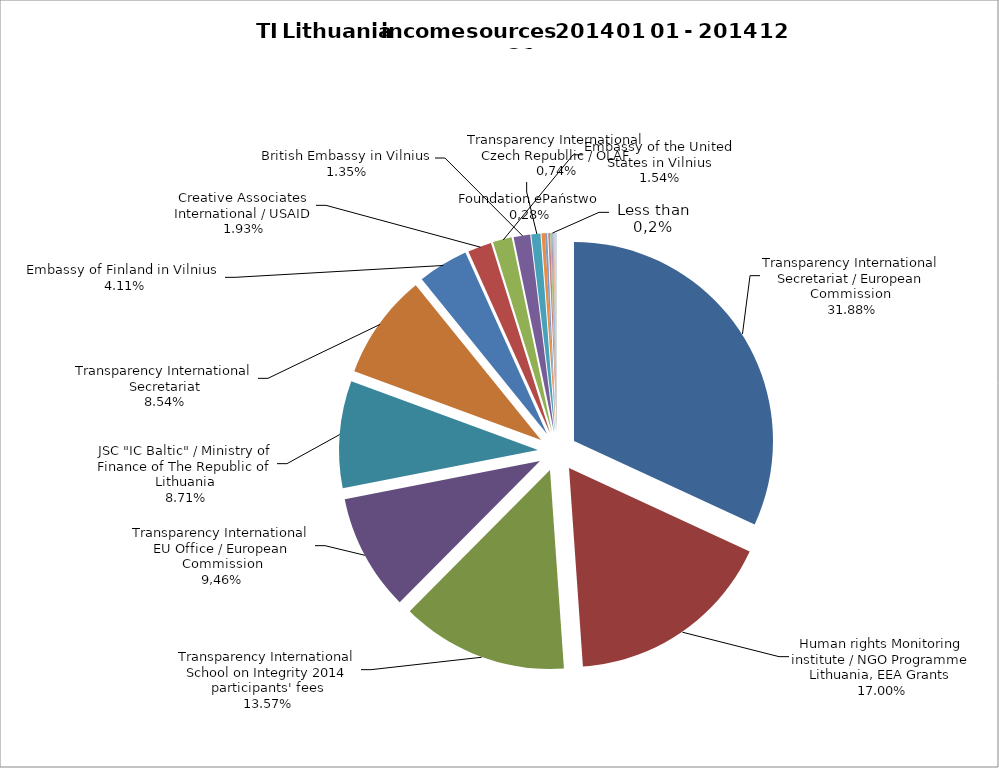
| Category | Income, LTL | Percentage, % |
|---|---|---|
| Transparency International Secretariat / European Commission  | 308089.47 | 31.881 |
| Human rights Monitoring institute / NGO Programme Lithuania, EEA Grants | 164324.14 | 17.004 |
| Transparency International School on Integrity 2014 participants' fees | 131124.23 | 13.568 |
| Transparency International EU Office / European Commission | 91418.27 | 9.46 |
| JSC "IC Baltic" / Ministry of Finance of The Republic of Lithuania | 84172.15 | 8.71 |
| Transparency International Secretariat | 82572.4 | 8.544 |
| Embassy of Finland in Vilnius  | 39707.2 | 4.109 |
| Creative Associates International / USAID | 18644.49 | 1.929 |
| Embassy of the United States in Vilnius | 14878.89 | 1.54 |
| British Embassy in Vilnius | 13000 | 1.345 |
| Transparency International Czech Republlic (TIC) / European Anti-Fraud Office (OLAF) | 7174.92 | 0.742 |
| Foundation ePaństwo (Hackathon "Code for Freedom" prize) | 2747.84 | 0.284 |
| Embassy of the Republic of Poland in Vilnius | 1726.4 | 0.179 |
| Embassy of France in Vilnius | 1517.24 | 0.157 |
| European Confederation of Independent Trade Unions (CESI) | 994.41 | 0.103 |
| Association  "Center for Civic Initiatives" | 740 | 0.077 |
| Donations by physical persons | 740 | 0.077 |
| Income tax donations | 702.58 | 0.073 |
| VšĮ "Goodwill Projects" (Initiative "ManoSeimas.lt")  (online fundraising campaign) | 565.39 | 0.059 |
| Association National Basketball League | 500 | 0.052 |
| VŠĮ "Center for Anti-Corruption" | 448.29 | 0.046 |
| Municipal Administration of Salcininkai district | 300 | 0.031 |
| Contributions of shareholders | 300 | 0.031 |